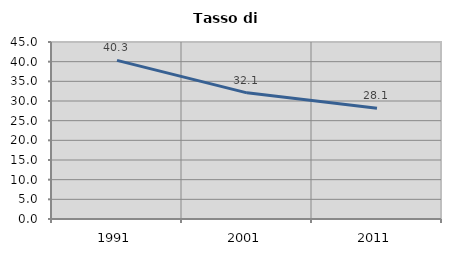
| Category | Tasso di disoccupazione   |
|---|---|
| 1991.0 | 40.32 |
| 2001.0 | 32.069 |
| 2011.0 | 28.129 |